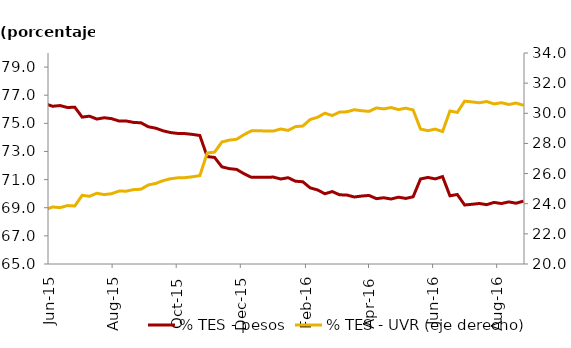
| Category | % TES - pesos |
|---|---|
| 2013-04-26 | 79.322 |
| 2013-05-03 | 79.326 |
| 2013-05-10 | 79.209 |
| 2013-05-17 | 79.291 |
| 2013-05-24 | 79.154 |
| 2013-05-31 | 79.1 |
| 2013-06-07 | 78.971 |
| 2013-06-14 | 79.032 |
| 2013-06-21 | 78.943 |
| 2013-06-28 | 78.752 |
| 2013-07-05 | 78.54 |
| 2013-07-12 | 78.684 |
| 2013-07-19 | 78.604 |
| 2013-07-26 | 78.835 |
| 2013-08-02 | 78.854 |
| 2013-08-09 | 78.789 |
| 2013-08-16 | 78.878 |
| 2013-08-23 | 78.798 |
| 2013-08-30 | 78.923 |
| 2013-09-06 | 78.838 |
| 2013-09-13 | 78.952 |
| 2013-09-20 | 78.753 |
| 2013-09-27 | 78.913 |
| 2013-10-04 | 78.629 |
| 2013-10-11 | 78.73 |
| 2013-10-18 | 78.526 |
| 2013-10-25 | 78.686 |
| 2013-11-01 | 78.488 |
| 2013-11-08 | 78.599 |
| 2013-11-15 | 78.084 |
| 2013-11-22 | 78.157 |
| 2013-11-29 | 78.221 |
| 2013-12-06 | 78.247 |
| 2013-12-13 | 78.282 |
| 2013-12-20 | 78.334 |
| 2013-12-27 | 78.367 |
| 2014-01-03 | 78.375 |
| 2014-01-10 | 78.384 |
| 2014-01-17 | 78.253 |
| 2014-01-24 | 78.04 |
| 2014-01-31 | 78.102 |
| 2014-02-07 | 77.961 |
| 2014-02-14 | 78.014 |
| 2014-02-21 | 77.692 |
| 2014-02-28 | 77.745 |
| 2014-03-07 | 77.613 |
| 2014-03-14 | 77.397 |
| 2014-03-21 | 77.11 |
| 2014-03-28 | 77.224 |
| 2014-04-04 | 76.849 |
| 2014-04-11 | 76.863 |
| 2014-04-18 | 76.721 |
| 2014-04-25 | 76.585 |
| 2014-05-02 | 76.488 |
| 2014-05-09 | 76.357 |
| 2014-05-16 | 75.174 |
| 2014-05-23 | 75.042 |
| 2014-05-30 | 75.168 |
| 2014-06-06 | 75.031 |
| 2014-06-13 | 75.604 |
| 2014-06-20 | 75.353 |
| 2014-06-27 | 75.416 |
| 2014-07-04 | 74.739 |
| 2014-07-11 | 74.894 |
| 2014-07-18 | 74.788 |
| 2014-07-25 | 74.957 |
| 2014-08-01 | 74.891 |
| 2014-08-08 | 74.846 |
| 2014-08-15 | 74.822 |
| 2014-08-22 | 74.505 |
| 2014-08-29 | 74.68 |
| 2014-09-05 | 74.448 |
| 2014-09-12 | 73.81 |
| 2014-09-19 | 73.899 |
| 2014-09-26 | 73.973 |
| 2014-10-03 | 74.051 |
| 2014-10-10 | 74.253 |
| 2014-10-17 | 74.523 |
| 2014-10-24 | 74.732 |
| 2014-10-31 | 74.822 |
| 2014-11-07 | 74.892 |
| 2014-11-14 | 74.726 |
| 2014-11-21 | 74.8 |
| 2014-11-28 | 74.808 |
| 2014-12-05 | 74.802 |
| 2014-12-12 | 74.794 |
| 2014-12-19 | 74.773 |
| 2014-12-26 | 74.771 |
| 2015-01-02 | 74.785 |
| 2015-01-09 | 74.658 |
| 2015-01-16 | 74.733 |
| 2015-01-23 | 74.474 |
| 2015-01-30 | 74.647 |
| 2015-02-06 | 74.407 |
| 2015-02-13 | 74.49 |
| 2015-02-20 | 74.34 |
| 2015-02-27 | 76.833 |
| 2015-03-06 | 76.683 |
| 2015-03-13 | 76.749 |
| 2015-03-20 | 76.524 |
| 2015-03-27 | 76.627 |
| 2015-04-03 | 76.592 |
| 2015-04-10 | 76.452 |
| 2015-04-17 | 76.495 |
| 2015-04-24 | 76.427 |
| 2015-05-01 | 76.552 |
| 2015-05-08 | 76.424 |
| 2015-05-15 | 76.472 |
| 2015-05-22 | 76.321 |
| 2015-05-29 | 76.387 |
| 2015-06-05 | 76.213 |
| 2015-06-12 | 76.263 |
| 2015-06-19 | 76.123 |
| 2015-06-26 | 76.149 |
| 2015-07-03 | 75.443 |
| 2015-07-10 | 75.509 |
| 2015-07-17 | 75.304 |
| 2015-07-24 | 75.397 |
| 2015-07-31 | 75.334 |
| 2015-08-07 | 75.164 |
| 2015-08-14 | 75.165 |
| 2015-08-21 | 75.064 |
| 2015-08-28 | 75.039 |
| 2015-09-04 | 74.755 |
| 2015-09-11 | 74.657 |
| 2015-09-18 | 74.469 |
| 2015-09-25 | 74.346 |
| 2015-10-02 | 74.282 |
| 2015-10-09 | 74.269 |
| 2015-10-16 | 74.213 |
| 2015-10-23 | 74.135 |
| 2015-10-30 | 72.637 |
| 2015-11-06 | 72.577 |
| 2015-11-13 | 71.906 |
| 2015-11-20 | 71.779 |
| 2015-11-27 | 71.724 |
| 2015-12-04 | 71.419 |
| 2015-12-11 | 71.165 |
| 2015-12-18 | 71.164 |
| 2015-12-25 | 71.17 |
| 2016-01-01 | 71.178 |
| 2016-01-08 | 71.043 |
| 2016-01-15 | 71.135 |
| 2016-01-22 | 70.886 |
| 2016-01-29 | 70.845 |
| 2016-02-05 | 70.413 |
| 2016-02-12 | 70.266 |
| 2016-02-19 | 69.993 |
| 2016-02-26 | 70.15 |
| 2016-03-04 | 69.92 |
| 2016-03-11 | 69.902 |
| 2016-03-18 | 69.764 |
| 2016-03-25 | 69.831 |
| 2016-04-01 | 69.874 |
| 2016-04-08 | 69.646 |
| 2016-04-15 | 69.709 |
| 2016-04-22 | 69.62 |
| 2016-04-29 | 69.752 |
| 2016-05-06 | 69.661 |
| 2016-05-13 | 69.78 |
| 2016-05-20 | 71.044 |
| 2016-05-27 | 71.154 |
| 2016-06-03 | 71.05 |
| 2016-06-10 | 71.215 |
| 2016-06-17 | 69.849 |
| 2016-06-24 | 69.941 |
| 2016-07-01 | 69.195 |
| 2016-07-08 | 69.245 |
| 2016-07-15 | 69.302 |
| 2016-07-22 | 69.218 |
| 2016-07-29 | 69.379 |
| 2016-08-05 | 69.298 |
| 2016-08-12 | 69.416 |
| 2016-08-19 | 69.32 |
| 2016-08-26 | 69.47 |